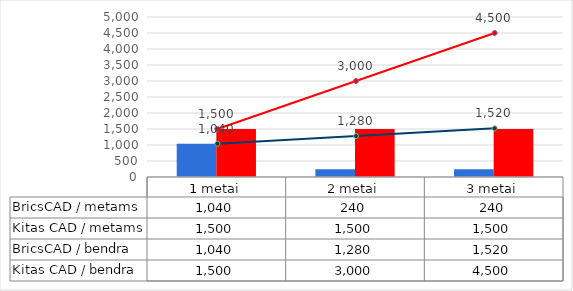
| Category | BricsCAD / metams | Kitas CAD / metams |
|---|---|---|
| 1 metai | 1040 | 1500 |
| 2 metai | 240 | 1500 |
| 3 metai | 240 | 1500 |